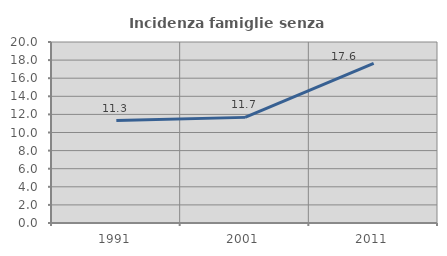
| Category | Incidenza famiglie senza nuclei |
|---|---|
| 1991.0 | 11.313 |
| 2001.0 | 11.671 |
| 2011.0 | 17.643 |